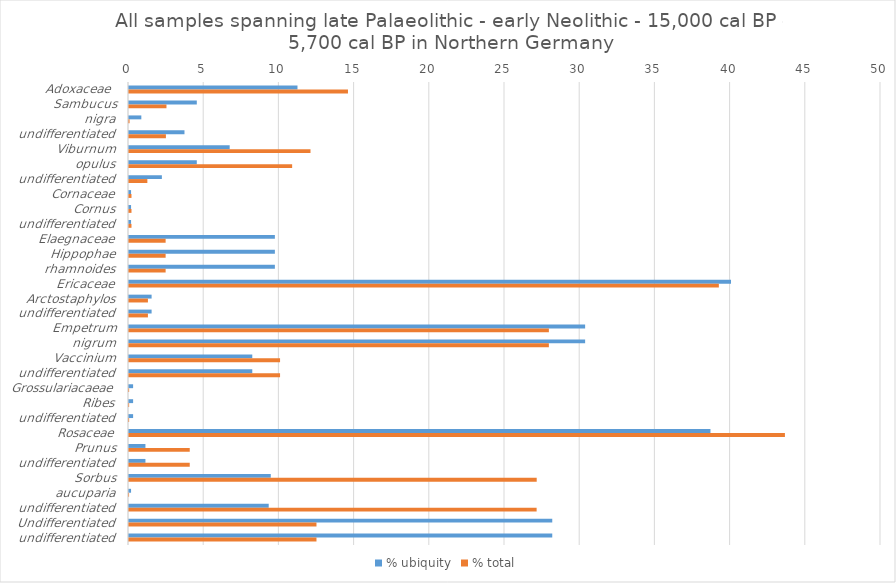
| Category | % ubiquity | % total |
|---|---|---|
| Adoxaceae  | 11.202 | 14.559 |
| Sambucus | 4.508 | 2.491 |
| nigra | 0.82 | 0.037 |
| undifferentiated | 3.689 | 2.454 |
| Viburnum | 6.694 | 12.068 |
| opulus | 4.508 | 10.847 |
| undifferentiated | 2.186 | 1.221 |
| Cornaceae | 0.137 | 0.165 |
| Cornus | 0.137 | 0.165 |
| undifferentiated | 0.137 | 0.165 |
| Elaegnaceae | 9.699 | 2.435 |
| Hippophae | 9.699 | 2.435 |
| rhamnoides | 9.699 | 2.435 |
| Ericaceae | 40.027 | 39.219 |
| Arctostaphylos | 1.503 | 1.258 |
| undifferentiated | 1.503 | 1.258 |
| Empetrum | 30.328 | 27.917 |
| nigrum | 30.328 | 27.917 |
| Vaccinium | 8.197 | 10.044 |
| undifferentiated | 8.197 | 10.044 |
| Grossulariacaeae | 0.273 | 0.009 |
| Ribes | 0.273 | 0.009 |
| undifferentiated | 0.273 | 0.009 |
| Rosaceae | 38.661 | 43.612 |
| Prunus | 1.093 | 4.039 |
| undifferentiated | 1.093 | 4.039 |
| Sorbus | 9.426 | 27.108 |
| aucuparia | 0.137 | 0.005 |
| undifferentiated | 9.29 | 27.103 |
| Undifferentiated | 28.142 | 12.465 |
| undifferentiated | 28.142 | 12.465 |